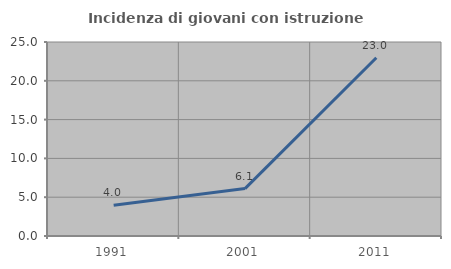
| Category | Incidenza di giovani con istruzione universitaria |
|---|---|
| 1991.0 | 3.96 |
| 2001.0 | 6.107 |
| 2011.0 | 22.973 |